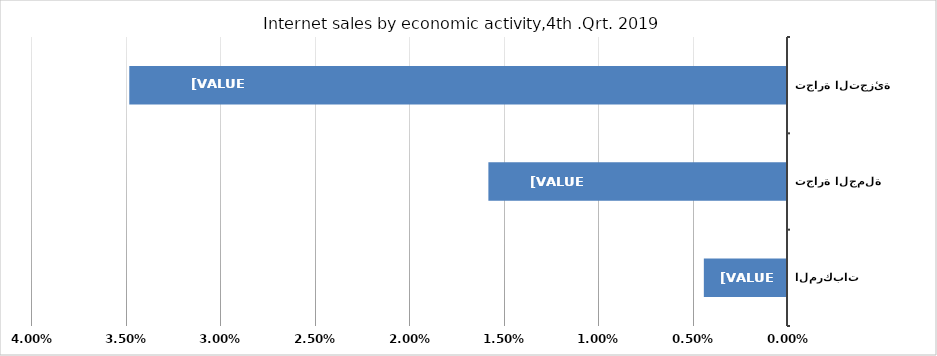
| Category | Series 0 |
|---|---|
| بيع وإصلاح المركبات  | 0.004 |
| تجارة الجملة | 0.016 |
| تجارة التجزئة | 0.035 |